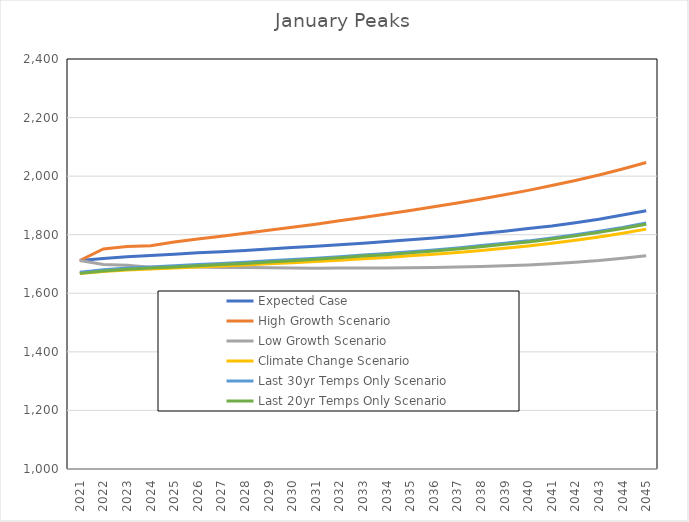
| Category | Expected Case | High Growth Scenario | Low Growth Scenario | Climate Change Scenario | Last 30yr Temps Only Scenario | Last 20yr Temps Only Scenario |
|---|---|---|---|---|---|---|
| 2021.0 | 1712 | 1711.871 | 1711.871 | 1667.261 | 1672 | 1668 |
| 2022.0 | 1719 | 1751.213 | 1698.535 | 1674.152 | 1680 | 1676 |
| 2023.0 | 1725 | 1759.466 | 1696.137 | 1679.331 | 1686 | 1682 |
| 2024.0 | 1729 | 1762.718 | 1688.981 | 1682.683 | 1690 | 1686 |
| 2025.0 | 1733 | 1775.24 | 1690.663 | 1686.049 | 1694 | 1690 |
| 2026.0 | 1738 | 1785.403 | 1690.027 | 1689.503 | 1698 | 1694 |
| 2027.0 | 1742 | 1794.62 | 1688.387 | 1693.058 | 1702 | 1698 |
| 2028.0 | 1746 | 1804.889 | 1687.746 | 1696.73 | 1706 | 1702 |
| 2029.0 | 1751 | 1815.214 | 1687.099 | 1700.54 | 1711 | 1707 |
| 2030.0 | 1756 | 1825.602 | 1686.44 | 1704.51 | 1715 | 1711 |
| 2031.0 | 1761 | 1836.051 | 1685.772 | 1708.665 | 1720 | 1716 |
| 2032.0 | 1766 | 1847.562 | 1686.094 | 1713.038 | 1725 | 1721 |
| 2033.0 | 1771 | 1859.14 | 1686.4 | 1717.664 | 1731 | 1727 |
| 2034.0 | 1777 | 1870.788 | 1686.69 | 1722.587 | 1736 | 1732 |
| 2035.0 | 1783 | 1882.508 | 1686.961 | 1727.855 | 1742 | 1738 |
| 2036.0 | 1789 | 1895.306 | 1688.209 | 1733.528 | 1748 | 1744 |
| 2037.0 | 1796 | 1908.192 | 1689.423 | 1739.673 | 1755 | 1751 |
| 2038.0 | 1804 | 1922.167 | 1691.603 | 1746.372 | 1763 | 1759 |
| 2039.0 | 1812 | 1936.243 | 1693.741 | 1753.718 | 1771 | 1767 |
| 2040.0 | 1821 | 1951.423 | 1696.832 | 1761.82 | 1779 | 1775 |
| 2041.0 | 1830 | 1967.735 | 1700.851 | 1770.809 | 1789 | 1785 |
| 2042.0 | 1841 | 1985.178 | 1705.8 | 1780.836 | 1800 | 1796 |
| 2043.0 | 1853 | 2003.774 | 1711.66 | 1792.076 | 1812 | 1808 |
| 2044.0 | 1867 | 2024.532 | 1719.424 | 1804.739 | 1825 | 1821 |
| 2045.0 | 1882 | 2046.511 | 1728.037 | 1819.066 | 1840 | 1836 |